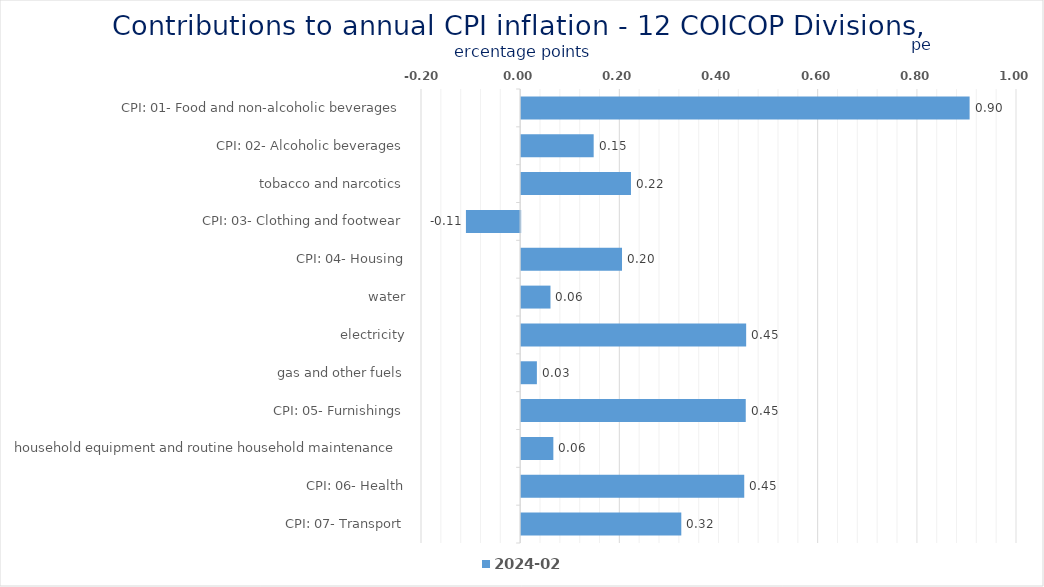
| Category | 2024-02 |
|---|---|
| CPI: 01- Food and non-alcoholic beverages | 0.904 |
| CPI: 02- Alcoholic beverages, tobacco and narcotics | 0.146 |
| CPI: 03- Clothing and footwear | 0.221 |
| CPI: 04- Housing, water, electricity, gas and other fuels | -0.109 |
| CPI: 05- Furnishings, household equipment and routine household maintenance | 0.203 |
| CPI: 06- Health | 0.059 |
| CPI: 07- Transport | 0.454 |
| CPI: 08- Communication | 0.032 |
| CPI: 09- Recreation and culture | 0.453 |
| CPI: 10- Education | 0.065 |
| CPI: 11- Restaurants and hotels | 0.45 |
| CPI: 12- Miscellaneous goods and services | 0.323 |